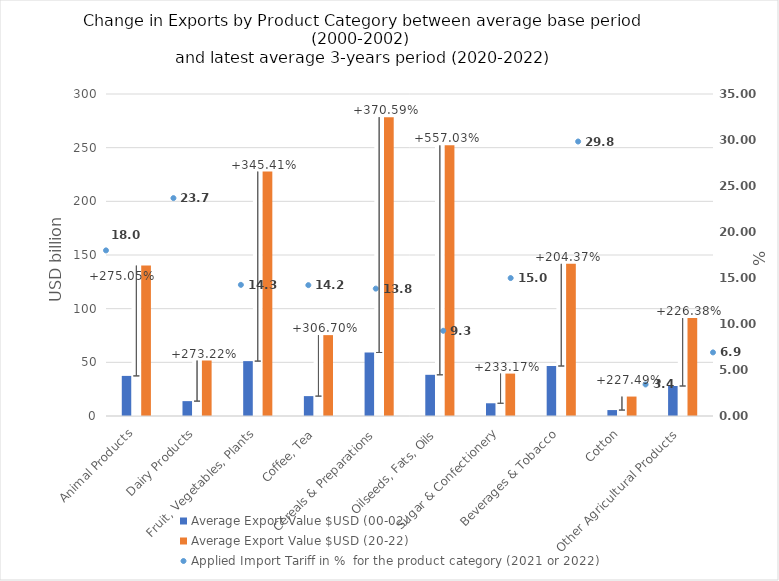
| Category | Average Export Value $USD (00-02) | Invisible Bar | Average Export Value $USD (20-22) |
|---|---|---|---|
| Animal Products | 37364.889 | 140137.082 | 140137.082 |
| Dairy Products | 13854.505 | 51707.327 | 51707.327 |
| Fruit, Vegetables, Plants | 51128.165 | 227728.918 | 227728.918 |
| Coffee, Tea | 18526.616 | 75348.655 | 75348.655 |
| Cereals & Preparations | 59167.923 | 278435.745 | 278435.745 |
| Oilseeds, Fats, Oils | 38375.294 | 252135.289 | 252135.289 |
| Sugar & Confectionery | 11859.625 | 39512.417 | 39512.417 |
| Beverages & Tobacco | 46578.478 | 141772.469 | 141772.469 |
| Cotton | 5531.4 | 18114.747 | 18114.747 |
| Other Agricultural Products  | 27943.45 | 91201.986 | 91201.986 |